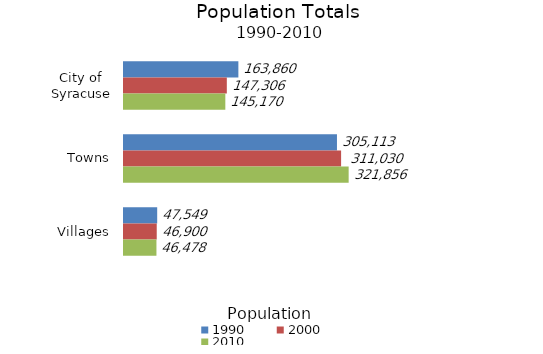
| Category | 1990 | 2000 | 2010 |
|---|---|---|---|
| City of Syracuse | 163860 | 147306 | 145170 |
| Towns | 305113 | 311030 | 321856 |
| Villages | 47549 | 46900 | 46478 |